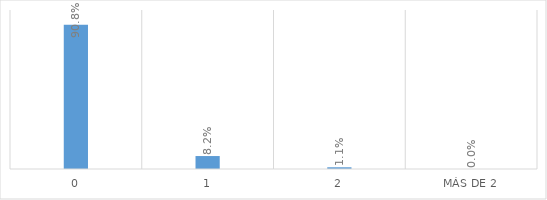
| Category | Series 0 |
|---|---|
| 0 | 0.908 |
| 1 | 0.082 |
| 2 | 0.011 |
| Más de 2 | 0 |